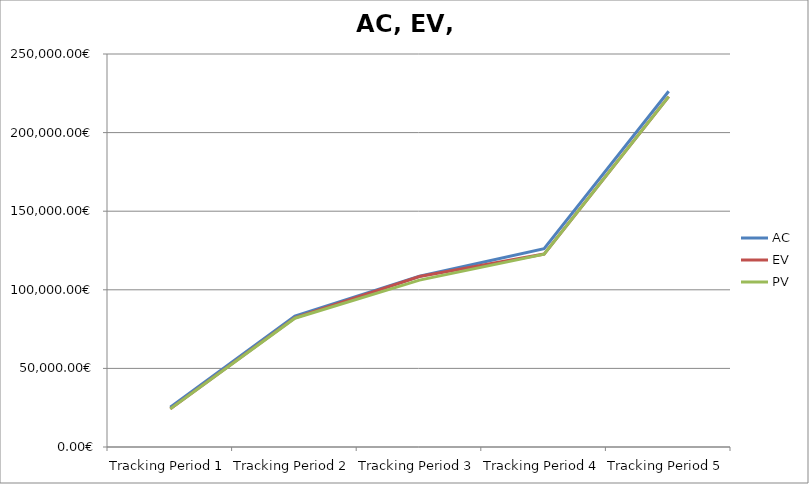
| Category | AC | EV | PV |
|---|---|---|---|
| Tracking Period 1 | 25242 | 24235 | 24235 |
| Tracking Period 2 | 83287 | 82205 | 81912 |
| Tracking Period 3 | 108630 | 108431 | 106175 |
| Tracking Period 4 | 126191 | 122712 | 122712 |
| Tracking Period 5 | 226285 | 222858 | 222858 |